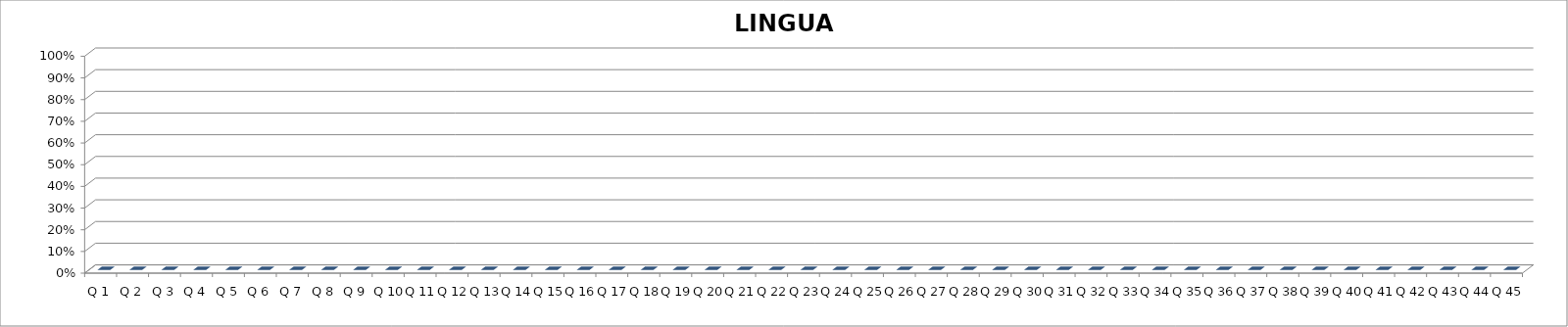
| Category | LINGUA PORTUGUESA |
|---|---|
| Q 1 | 0 |
| Q 2 | 0 |
| Q 3 | 0 |
| Q 4 | 0 |
| Q 5 | 0 |
| Q 6 | 0 |
| Q 7 | 0 |
| Q 8 | 0 |
| Q 9 | 0 |
| Q 10 | 0 |
| Q 11 | 0 |
| Q 12 | 0 |
| Q 13 | 0 |
| Q 14 | 0 |
| Q 15 | 0 |
| Q 16 | 0 |
| Q 17 | 0 |
| Q 18 | 0 |
| Q 19 | 0 |
| Q 20 | 0 |
| Q 21 | 0 |
| Q 22 | 0 |
| Q 23 | 0 |
| Q 24 | 0 |
| Q 25 | 0 |
| Q 26 | 0 |
| Q 27 | 0 |
| Q 28 | 0 |
| Q 29 | 0 |
| Q 30 | 0 |
| Q 31 | 0 |
| Q 32 | 0 |
| Q 33 | 0 |
| Q 34 | 0 |
| Q 35 | 0 |
| Q 36 | 0 |
| Q 37 | 0 |
| Q 38 | 0 |
| Q 39 | 0 |
| Q 40 | 0 |
| Q 41 | 0 |
| Q 42 | 0 |
| Q 43 | 0 |
| Q 44 | 0 |
| Q 45 | 0 |